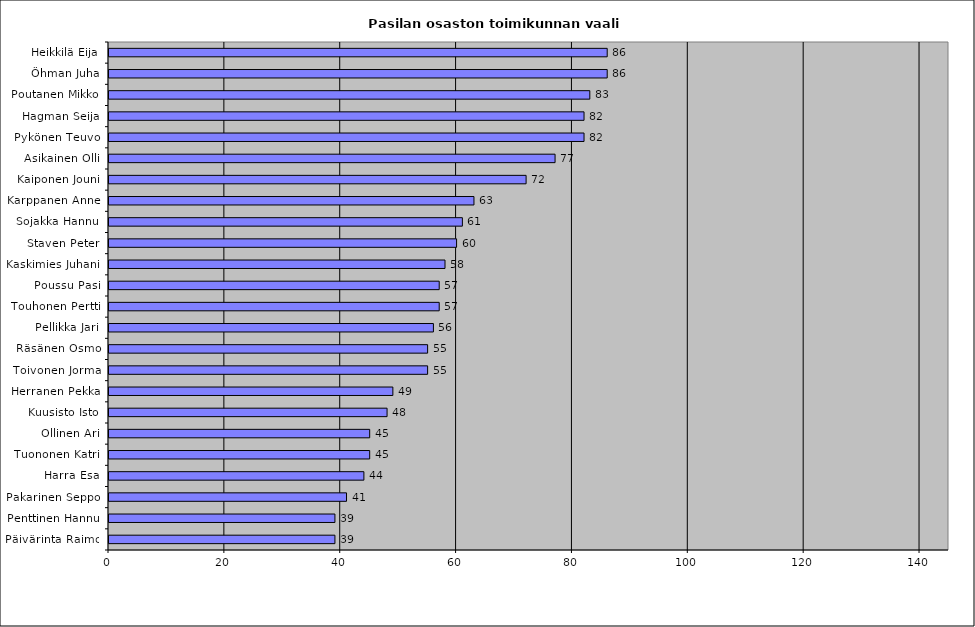
| Category | Series 0 |
|---|---|
| Heikkilä Eija | 86 |
| Öhman Juha | 86 |
| Poutanen Mikko | 83 |
| Hagman Seija | 82 |
| Pykönen Teuvo | 82 |
| Asikainen Olli | 77 |
| Kaiponen Jouni | 72 |
| Karppanen Anne | 63 |
| Sojakka Hannu | 61 |
| Staven Peter | 60 |
| Kaskimies Juhani | 58 |
| Poussu Pasi | 57 |
| Touhonen Pertti | 57 |
| Pellikka Jari | 56 |
| Räsänen Osmo | 55 |
| Toivonen Jorma | 55 |
| Herranen Pekka | 49 |
| Kuusisto Isto | 48 |
| Ollinen Ari | 45 |
| Tuononen Katri | 45 |
| Harra Esa | 44 |
| Pakarinen Seppo | 41 |
| Penttinen Hannu | 39 |
| Päivärinta Raimo | 39 |